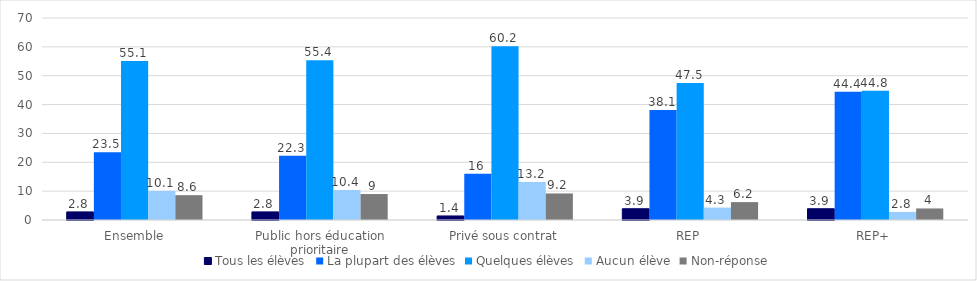
| Category | Tous les élèves | La plupart des élèves | Quelques élèves | Aucun élève | Non-réponse |
|---|---|---|---|---|---|
| Ensemble | 2.8 | 23.5 | 55.1 | 10.1 | 8.6 |
| Public hors éducation prioritaire | 2.8 | 22.3 | 55.4 | 10.4 | 9 |
| Privé sous contrat | 1.4 | 16 | 60.2 | 13.2 | 9.2 |
| REP | 3.9 | 38.1 | 47.5 | 4.3 | 6.2 |
| REP+ | 3.9 | 44.4 | 44.8 | 2.8 | 4 |